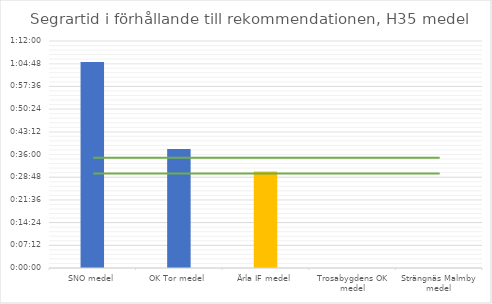
| Category | H35 tid |
|---|---|
| SNO medel | 0.045 |
| OK Tor medel | 0.026 |
| Ärla IF medel | 0.021 |
| Trosabygdens OK medel | 0 |
| Strängnäs Malmby medel | 0 |